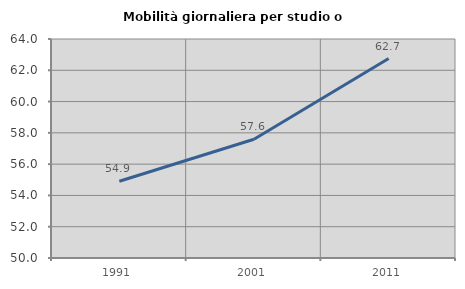
| Category | Mobilità giornaliera per studio o lavoro |
|---|---|
| 1991.0 | 54.91 |
| 2001.0 | 57.593 |
| 2011.0 | 62.749 |